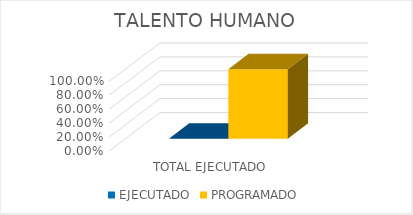
| Category | EJECUTADO | PROGRAMADO |
|---|---|---|
| TOTAL EJECUTADO  | 0 | 1 |